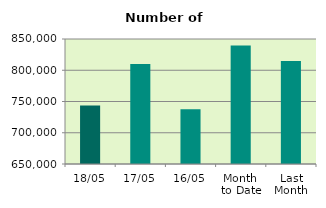
| Category | Series 0 |
|---|---|
| 18/05 | 743570 |
| 17/05 | 809872 |
| 16/05 | 737764 |
| Month 
to Date | 839465.846 |
| Last
Month | 814883.684 |